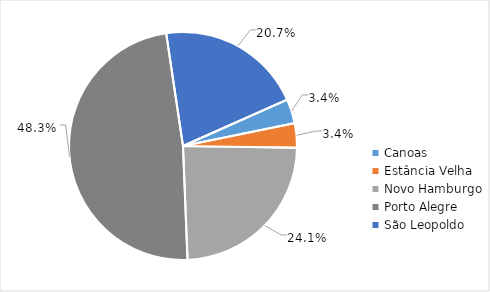
| Category | Series 0 |
|---|---|
| Canoas | 0.034 |
| Estância Velha | 0.034 |
| Novo Hamburgo | 0.241 |
| Porto Alegre | 0.483 |
| São Leopoldo | 0.207 |